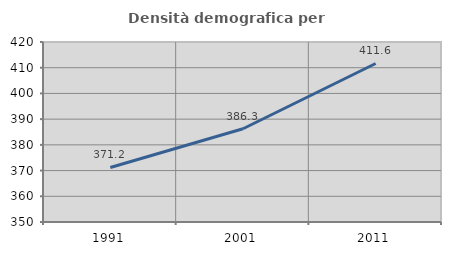
| Category | Densità demografica |
|---|---|
| 1991.0 | 371.198 |
| 2001.0 | 386.256 |
| 2011.0 | 411.642 |